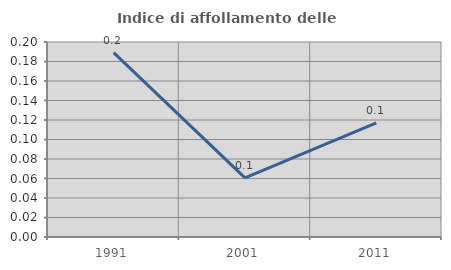
| Category | Indice di affollamento delle abitazioni  |
|---|---|
| 1991.0 | 0.189 |
| 2001.0 | 0.061 |
| 2011.0 | 0.117 |